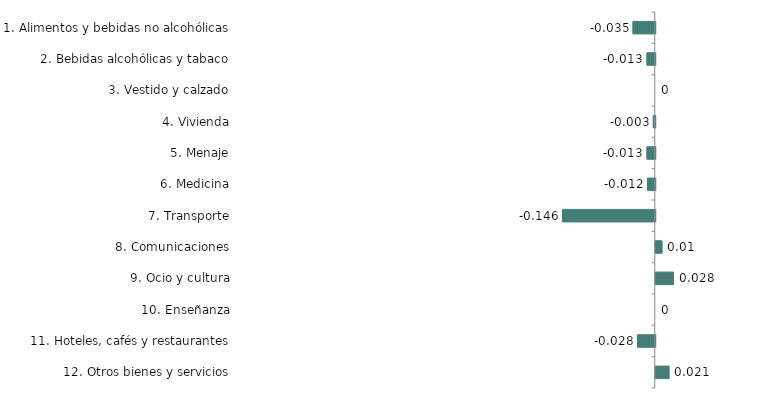
| Category | Series 0 |
|---|---|
| 1. Alimentos y bebidas no alcohólicas | -0.035 |
| 2. Bebidas alcohólicas y tabaco | -0.013 |
| 3. Vestido y calzado | 0 |
| 4. Vivienda | -0.003 |
| 5. Menaje | -0.013 |
| 6. Medicina | -0.012 |
| 7. Transporte | -0.146 |
| 8. Comunicaciones | 0.01 |
| 9. Ocio y cultura | 0.028 |
| 10. Enseñanza | 0 |
| 11. Hoteles, cafés y restaurantes | -0.028 |
| 12. Otros bienes y servicios | 0.021 |